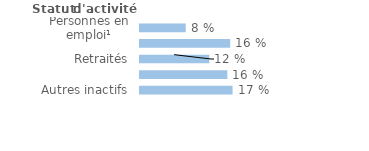
| Category | Series 0 |
|---|---|
| Personnes en emploi¹ | 0.082 |
| Chômeurs | 0.161 |
| Retraités | 0.124 |
| Étudiants, élèves | 0.156 |
| Autres inactifs  | 0.165 |